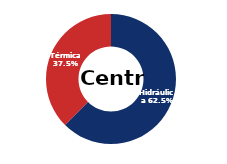
| Category | Centro |
|---|---|
| Eólica | 0 |
| Hidráulica | 2489.627 |
| Solar | 0.006 |
| Térmica | 1492.686 |